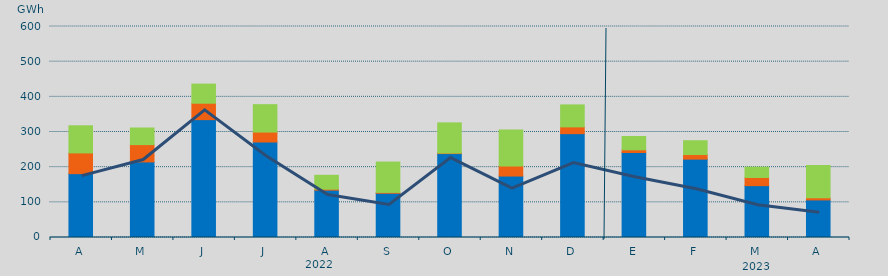
| Category | Asignación SEPE | Asignación Francia | Asignación Portugal |
|---|---|---|---|
| A | 181585.4 | 58889.7 | 77145.2 |
| M | 214905.3 | 49218 | 47192.7 |
| J | 335176.8 | 46679.2 | 54371.7 |
| J | 271567.05 | 28179 | 77960.7 |
| A | 134609.35 | 2839.1 | 39441.4 |
| S | 125828.7 | 2385 | 86328.9 |
| O | 238619.175 | 1385 | 85885 |
| N | 174742.7 | 28420.1 | 102571.3 |
| D | 295334.825 | 19231.9 | 62469.6 |
| E | 241649.025 | 7715.1 | 37807.2 |
| F | 222841.2 | 13030.5 | 39359.9 |
| M | 147441.275 | 23234.4 | 29375.8 |
| A | 106835.5 | 6126.3 | 91808.3 |